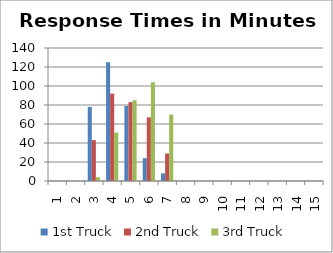
| Category | 1st Truck | 2nd Truck | 3rd Truck |
|---|---|---|---|
| 1.0 | 0 | 0 | 0 |
| 2.0 | 0 | 0 | 0 |
| 3.0 | 78 | 43 | 4 |
| 4.0 | 125 | 92 | 51 |
| 5.0 | 79 | 83 | 85 |
| 6.0 | 24 | 67 | 104 |
| 7.0 | 8 | 29 | 70 |
| 8.0 | 0 | 0 | 0 |
| 9.0 | 0 | 0 | 0 |
| 10.0 | 0 | 0 | 0 |
| 11.0 | 0 | 0 | 0 |
| 12.0 | 0 | 0 | 0 |
| 13.0 | 0 | 0 | 0 |
| 14.0 | 0 | 0 | 0 |
| 15.0 | 0 | 0 | 0 |